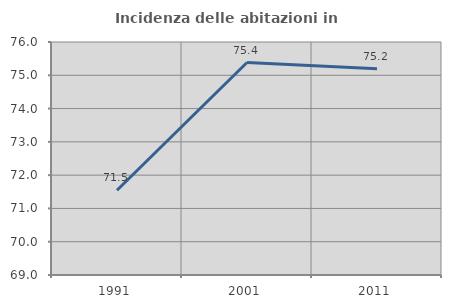
| Category | Incidenza delle abitazioni in proprietà  |
|---|---|
| 1991.0 | 71.547 |
| 2001.0 | 75.384 |
| 2011.0 | 75.199 |